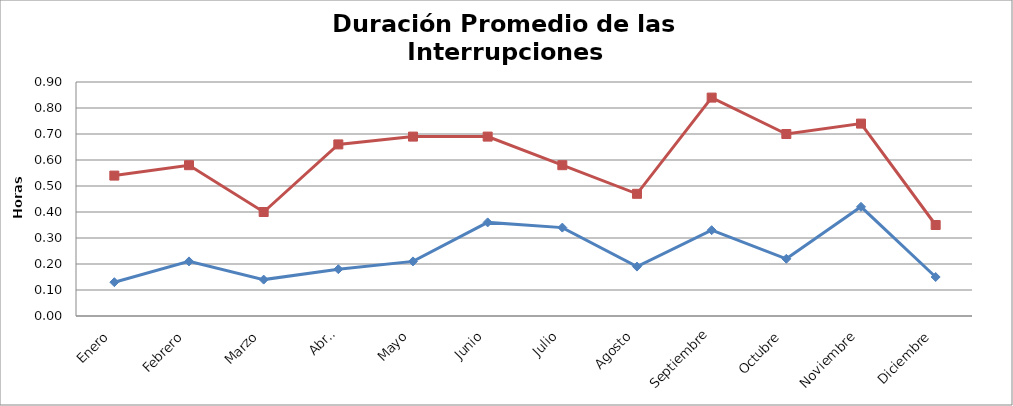
| Category | Interno | Total |
|---|---|---|
| Enero | 0.13 | 0.54 |
| Febrero | 0.21 | 0.58 |
| Marzo | 0.14 | 0.4 |
| Abril | 0.18 | 0.66 |
| Mayo | 0.21 | 0.69 |
| Junio | 0.36 | 0.69 |
| Julio | 0.34 | 0.58 |
| Agosto | 0.19 | 0.47 |
| Septiembre | 0.33 | 0.84 |
| Octubre | 0.22 | 0.7 |
| Noviembre | 0.42 | 0.74 |
| Diciembre | 0.15 | 0.35 |